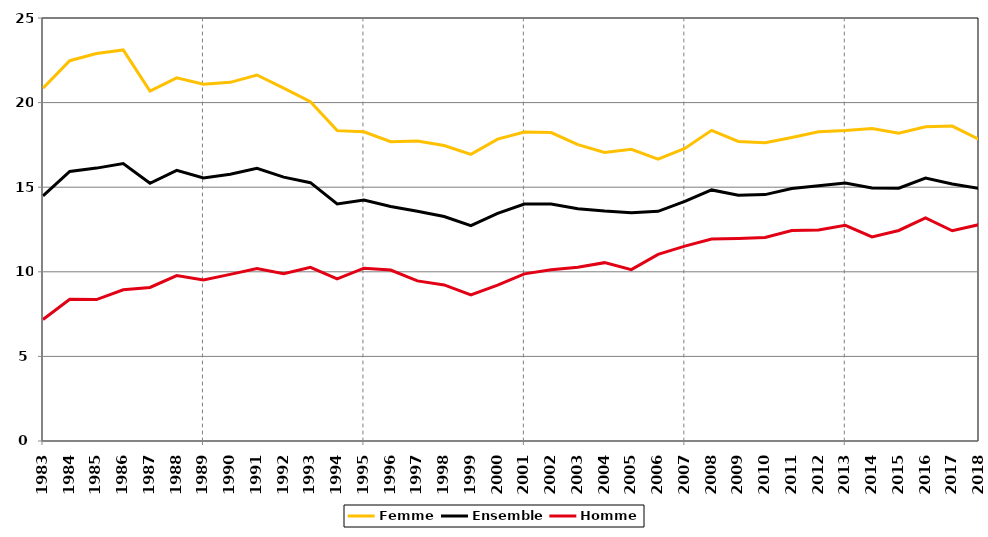
| Category | Femme | Ensemble | Homme |
|---|---|---|---|
| 1983.0 | 20.853 | 14.493 | 7.177 |
| 1984.0 | 22.477 | 15.932 | 8.373 |
| 1985.0 | 22.899 | 16.128 | 8.358 |
| 1986.0 | 23.112 | 16.4 | 8.939 |
| 1987.0 | 20.675 | 15.231 | 9.073 |
| 1988.0 | 21.466 | 15.997 | 9.777 |
| 1989.0 | 21.083 | 15.547 | 9.516 |
| 1990.0 | 21.196 | 15.762 | 9.849 |
| 1991.0 | 21.632 | 16.111 | 10.199 |
| 1992.0 | 20.858 | 15.597 | 9.894 |
| 1993.0 | 20.058 | 15.268 | 10.262 |
| 1994.0 | 18.343 | 14.009 | 9.587 |
| 1995.0 | 18.271 | 14.241 | 10.215 |
| 1996.0 | 17.69 | 13.861 | 10.107 |
| 1997.0 | 17.724 | 13.574 | 9.463 |
| 1998.0 | 17.465 | 13.268 | 9.224 |
| 1999.0 | 16.94 | 12.729 | 8.629 |
| 2000.0 | 17.844 | 13.458 | 9.21 |
| 2001.0 | 18.266 | 14.008 | 9.877 |
| 2002.0 | 18.23 | 14.01 | 10.125 |
| 2003.0 | 17.513 | 13.73 | 10.272 |
| 2004.0 | 17.051 | 13.586 | 10.54 |
| 2005.0 | 17.241 | 13.485 | 10.129 |
| 2006.0 | 16.658 | 13.573 | 11.029 |
| 2007.0 | 17.289 | 14.166 | 11.516 |
| 2008.0 | 18.358 | 14.839 | 11.934 |
| 2009.0 | 17.703 | 14.522 | 11.974 |
| 2010.0 | 17.628 | 14.562 | 12.025 |
| 2011.0 | 17.935 | 14.922 | 12.434 |
| 2012.0 | 18.279 | 15.086 | 12.473 |
| 2013.0 | 18.351 | 15.247 | 12.743 |
| 2014.0 | 18.465 | 14.96 | 12.062 |
| 2015.0 | 18.188 | 14.943 | 12.443 |
| 2016.0 | 18.575 | 15.534 | 13.18 |
| 2017.0 | 18.613 | 15.184 | 12.425 |
| 2018.0 | 17.831 | 14.934 | 12.789 |